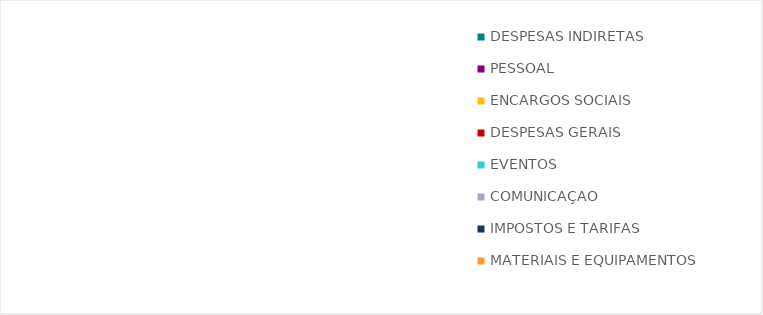
| Category | Series 0 |
|---|---|
| DESPESAS INDIRETAS | 0 |
| PESSOAL | 0 |
| ENCARGOS SOCIAIS | 0 |
| DESPESAS GERAIS | 0 |
| EVENTOS | 0 |
| COMUNICAÇÃO | 0 |
| IMPOSTOS E TARIFAS | 0 |
| MATERIAIS E EQUIPAMENTOS | 0 |